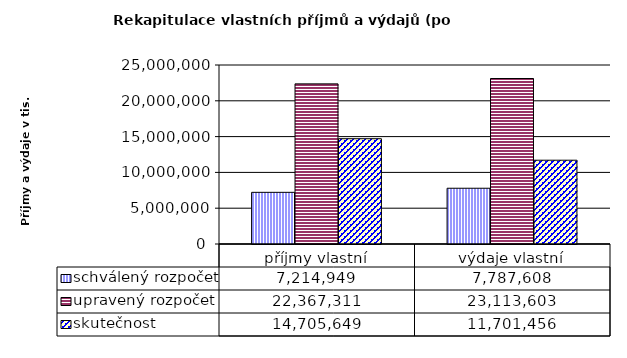
| Category | schválený rozpočet | upravený rozpočet | skutečnost |
|---|---|---|---|
| příjmy vlastní | 7214949 | 22367311 | 14705649 |
| výdaje vlastní | 7787608 | 23113603 | 11701456 |